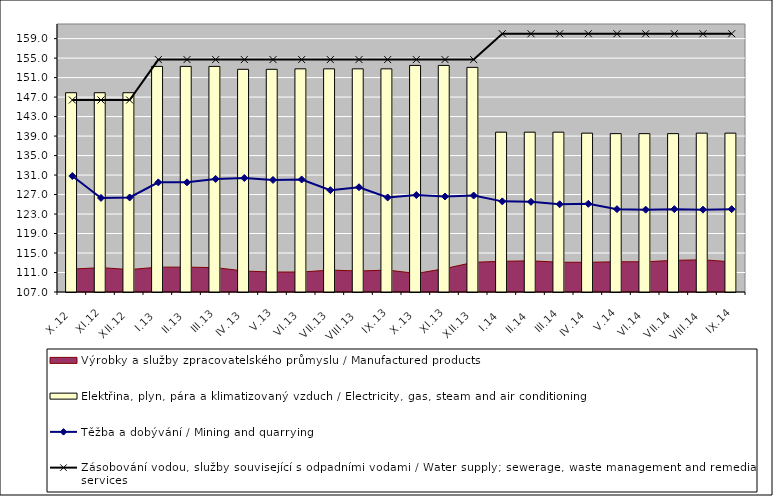
| Category | Elektřina, plyn, pára a klimatizovaný vzduch / Electricity, gas, steam and air conditioning |
|---|---|
| X.12 | 147.9 |
| XI.12 | 147.9 |
| XII.12 | 147.9 |
| I.13 | 153.3 |
| II.13 | 153.3 |
| III.13 | 153.3 |
| IV.13 | 152.7 |
| V.13 | 152.7 |
| VI.13 | 152.8 |
| VII.13 | 152.8 |
| VIII.13 | 152.8 |
| IX.13 | 152.8 |
| X.13 | 153.5 |
| XI.13 | 153.5 |
| XII.13 | 153.1 |
| I.14 | 139.8 |
| II.14 | 139.8 |
| III.14 | 139.8 |
| IV.14 | 139.6 |
| V.14 | 139.5 |
| VI.14 | 139.5 |
| VII.14 | 139.5 |
| VIII.14 | 139.6 |
| IX.14 | 139.6 |